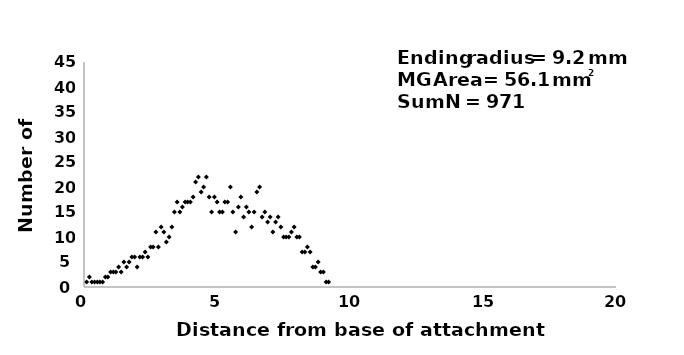
| Category | Untreated |
|---|---|
| 0.1 | 1 |
| 0.2 | 2 |
| 0.3 | 1 |
| 0.4 | 1 |
| 0.5 | 1 |
| 0.6 | 1 |
| 0.7 | 1 |
| 0.8 | 2 |
| 0.9 | 2 |
| 1.0 | 3 |
| 1.1 | 3 |
| 1.2 | 3 |
| 1.3 | 4 |
| 1.4 | 3 |
| 1.5 | 5 |
| 1.6 | 4 |
| 1.7 | 5 |
| 1.8 | 6 |
| 1.9 | 6 |
| 2.0 | 4 |
| 2.1 | 6 |
| 2.2 | 6 |
| 2.3 | 7 |
| 2.4 | 6 |
| 2.5 | 8 |
| 2.6 | 8 |
| 2.7 | 11 |
| 2.8 | 8 |
| 2.9 | 12 |
| 3.0 | 11 |
| 3.1 | 9 |
| 3.2 | 10 |
| 3.3 | 12 |
| 3.4 | 15 |
| 3.5 | 17 |
| 3.6 | 15 |
| 3.7 | 16 |
| 3.8 | 17 |
| 3.9 | 17 |
| 4.0 | 17 |
| 4.1 | 18 |
| 4.2 | 21 |
| 4.3 | 22 |
| 4.4 | 19 |
| 4.5 | 20 |
| 4.6 | 22 |
| 4.7 | 18 |
| 4.8 | 15 |
| 4.9 | 18 |
| 5.0 | 17 |
| 5.1 | 15 |
| 5.2 | 15 |
| 5.3 | 17 |
| 5.4 | 17 |
| 5.5 | 20 |
| 5.6 | 15 |
| 5.7 | 11 |
| 5.8 | 16 |
| 5.9 | 18 |
| 6.0 | 14 |
| 6.1 | 16 |
| 6.2 | 15 |
| 6.3 | 12 |
| 6.4 | 15 |
| 6.5 | 19 |
| 6.6 | 20 |
| 6.7 | 14 |
| 6.8 | 15 |
| 6.9 | 13 |
| 7.0 | 14 |
| 7.1 | 11 |
| 7.2 | 13 |
| 7.3 | 14 |
| 7.4 | 12 |
| 7.5 | 10 |
| 7.6 | 10 |
| 7.7 | 10 |
| 7.8 | 11 |
| 7.9 | 12 |
| 8.0 | 10 |
| 8.1 | 10 |
| 8.2 | 7 |
| 8.3 | 7 |
| 8.4 | 8 |
| 8.5 | 7 |
| 8.6 | 4 |
| 8.7 | 4 |
| 8.8 | 5 |
| 8.9 | 3 |
| 9.0 | 3 |
| 9.1 | 1 |
| 9.2 | 1 |